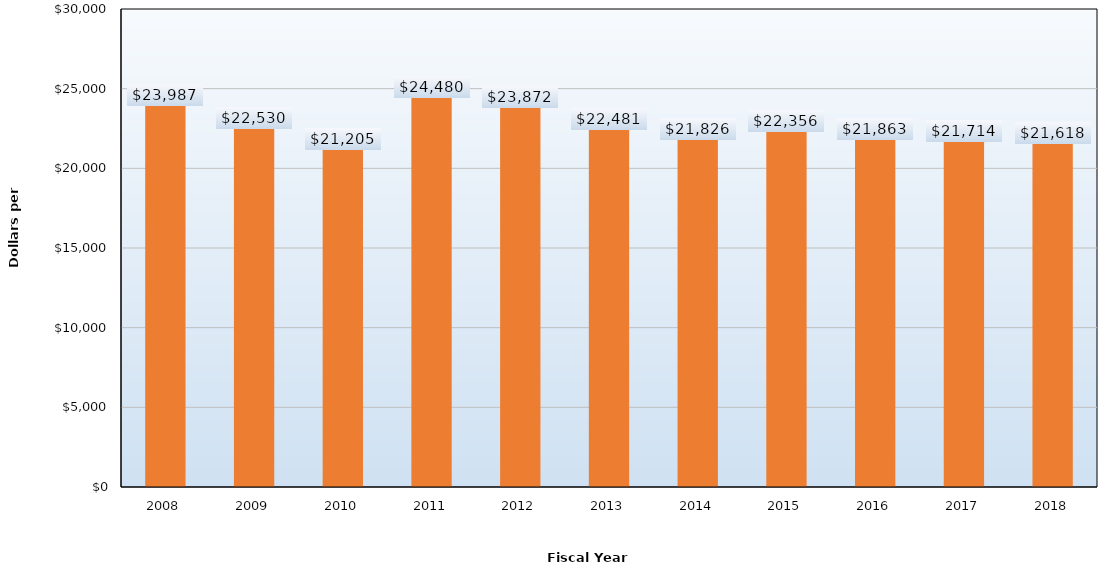
| Category | Dollars per FTE |
|---|---|
| 2008.0 | 23987 |
| 2009.0 | 22530 |
| 2010.0 | 21205 |
| 2011.0 | 24480 |
| 2012.0 | 23872 |
| 2013.0 | 22481 |
| 2014.0 | 21826 |
| 2015.0 | 22356 |
| 2016.0 | 21863 |
| 2017.0 | 21714 |
| 2018.0 | 21618 |